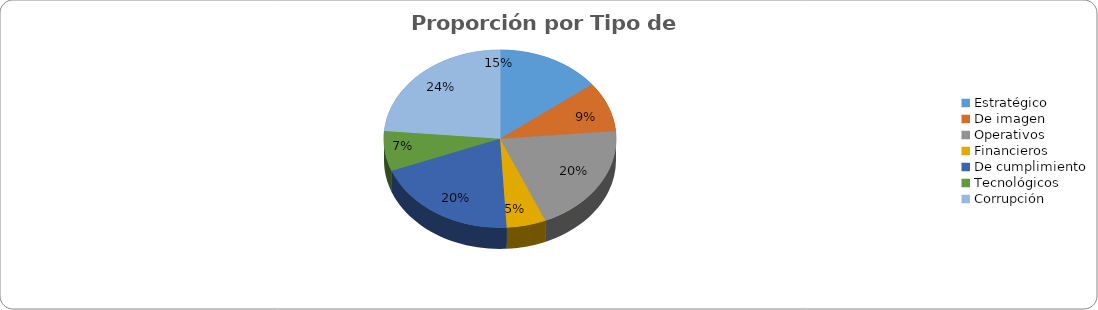
| Category | Series 0 |
|---|---|
| Estratégico | 8 |
| De imagen | 5 |
| Operativos | 11 |
| Financieros | 3 |
| De cumplimiento | 11 |
| Tecnológicos | 4 |
| Corrupción | 13 |